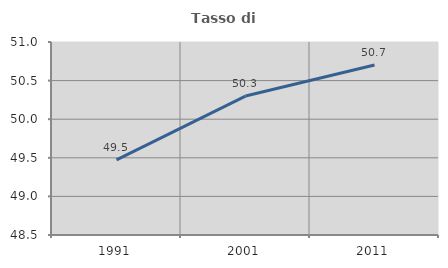
| Category | Tasso di occupazione   |
|---|---|
| 1991.0 | 49.473 |
| 2001.0 | 50.3 |
| 2011.0 | 50.703 |